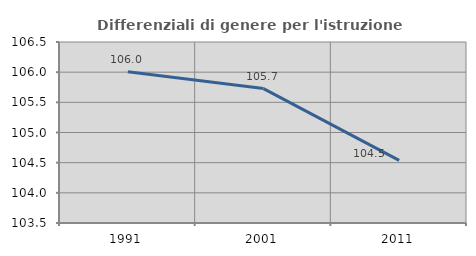
| Category | Differenziali di genere per l'istruzione superiore |
|---|---|
| 1991.0 | 106.006 |
| 2001.0 | 105.728 |
| 2011.0 | 104.539 |